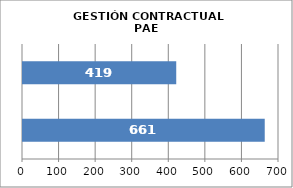
| Category | GESTIÓN CONTRACTUAL PAE |
|---|---|
| # Contratos Programados | 661 |
| # Contratos Suscritos | 419 |